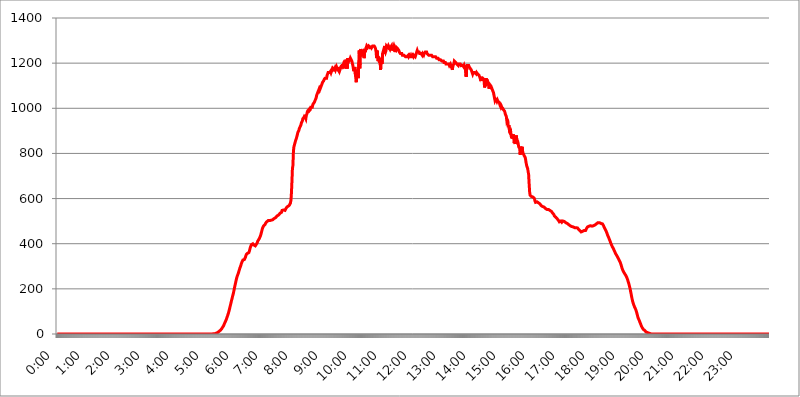
| Category | 2015.04.22. Intenzitás [W/m^2] |
|---|---|
| 0.0 | -0.256 |
| 0.0006944444444444445 | -0.256 |
| 0.001388888888888889 | -0.256 |
| 0.0020833333333333333 | -0.256 |
| 0.002777777777777778 | -0.256 |
| 0.003472222222222222 | -0.256 |
| 0.004166666666666667 | -0.256 |
| 0.004861111111111111 | -0.256 |
| 0.005555555555555556 | -0.256 |
| 0.0062499999999999995 | -0.256 |
| 0.006944444444444444 | -0.256 |
| 0.007638888888888889 | -0.256 |
| 0.008333333333333333 | -0.256 |
| 0.009027777777777779 | -0.256 |
| 0.009722222222222222 | -0.256 |
| 0.010416666666666666 | -0.256 |
| 0.011111111111111112 | -0.256 |
| 0.011805555555555555 | -0.256 |
| 0.012499999999999999 | -0.256 |
| 0.013194444444444444 | -0.256 |
| 0.013888888888888888 | -0.256 |
| 0.014583333333333332 | -0.256 |
| 0.015277777777777777 | -0.256 |
| 0.015972222222222224 | -0.256 |
| 0.016666666666666666 | -0.256 |
| 0.017361111111111112 | -0.256 |
| 0.018055555555555557 | -0.256 |
| 0.01875 | -0.256 |
| 0.019444444444444445 | -0.256 |
| 0.02013888888888889 | -0.256 |
| 0.020833333333333332 | -0.256 |
| 0.02152777777777778 | -0.256 |
| 0.022222222222222223 | -0.256 |
| 0.02291666666666667 | -0.256 |
| 0.02361111111111111 | -0.256 |
| 0.024305555555555556 | -0.256 |
| 0.024999999999999998 | -0.256 |
| 0.025694444444444447 | -0.256 |
| 0.02638888888888889 | -0.256 |
| 0.027083333333333334 | -0.256 |
| 0.027777777777777776 | -0.256 |
| 0.02847222222222222 | -0.256 |
| 0.029166666666666664 | -0.256 |
| 0.029861111111111113 | -0.256 |
| 0.030555555555555555 | -0.256 |
| 0.03125 | -0.256 |
| 0.03194444444444445 | -0.256 |
| 0.03263888888888889 | -0.256 |
| 0.03333333333333333 | -0.256 |
| 0.034027777777777775 | -0.256 |
| 0.034722222222222224 | -0.256 |
| 0.035416666666666666 | -0.256 |
| 0.036111111111111115 | -0.256 |
| 0.03680555555555556 | -0.256 |
| 0.0375 | -0.256 |
| 0.03819444444444444 | -0.256 |
| 0.03888888888888889 | -0.256 |
| 0.03958333333333333 | -0.256 |
| 0.04027777777777778 | -0.256 |
| 0.04097222222222222 | -0.256 |
| 0.041666666666666664 | -0.256 |
| 0.042361111111111106 | -0.256 |
| 0.04305555555555556 | -0.256 |
| 0.043750000000000004 | -0.256 |
| 0.044444444444444446 | -0.256 |
| 0.04513888888888889 | -0.256 |
| 0.04583333333333334 | -0.256 |
| 0.04652777777777778 | -0.256 |
| 0.04722222222222222 | -0.256 |
| 0.04791666666666666 | -0.256 |
| 0.04861111111111111 | -0.256 |
| 0.049305555555555554 | -0.256 |
| 0.049999999999999996 | -0.256 |
| 0.05069444444444445 | -0.256 |
| 0.051388888888888894 | -0.256 |
| 0.052083333333333336 | -0.256 |
| 0.05277777777777778 | -0.256 |
| 0.05347222222222222 | -0.256 |
| 0.05416666666666667 | -0.256 |
| 0.05486111111111111 | -0.256 |
| 0.05555555555555555 | -0.256 |
| 0.05625 | -0.256 |
| 0.05694444444444444 | -0.256 |
| 0.057638888888888885 | -0.256 |
| 0.05833333333333333 | -0.256 |
| 0.05902777777777778 | -0.256 |
| 0.059722222222222225 | -0.256 |
| 0.06041666666666667 | -0.256 |
| 0.061111111111111116 | -0.256 |
| 0.06180555555555556 | -0.256 |
| 0.0625 | -0.256 |
| 0.06319444444444444 | -0.256 |
| 0.06388888888888888 | -0.256 |
| 0.06458333333333334 | -0.256 |
| 0.06527777777777778 | -0.256 |
| 0.06597222222222222 | -0.256 |
| 0.06666666666666667 | -0.256 |
| 0.06736111111111111 | -0.256 |
| 0.06805555555555555 | -0.256 |
| 0.06874999999999999 | -0.256 |
| 0.06944444444444443 | -0.256 |
| 0.07013888888888889 | -0.256 |
| 0.07083333333333333 | -0.256 |
| 0.07152777777777779 | -0.256 |
| 0.07222222222222223 | -0.256 |
| 0.07291666666666667 | -0.256 |
| 0.07361111111111111 | -0.256 |
| 0.07430555555555556 | -0.256 |
| 0.075 | -0.256 |
| 0.07569444444444444 | -0.256 |
| 0.0763888888888889 | -0.256 |
| 0.07708333333333334 | -0.256 |
| 0.07777777777777778 | -0.256 |
| 0.07847222222222222 | -0.256 |
| 0.07916666666666666 | -0.256 |
| 0.0798611111111111 | -0.256 |
| 0.08055555555555556 | -0.256 |
| 0.08125 | -0.256 |
| 0.08194444444444444 | -0.256 |
| 0.08263888888888889 | -0.256 |
| 0.08333333333333333 | -0.256 |
| 0.08402777777777777 | -0.256 |
| 0.08472222222222221 | -0.256 |
| 0.08541666666666665 | -0.256 |
| 0.08611111111111112 | -0.256 |
| 0.08680555555555557 | -0.256 |
| 0.08750000000000001 | -0.256 |
| 0.08819444444444445 | -0.256 |
| 0.08888888888888889 | -0.256 |
| 0.08958333333333333 | -0.256 |
| 0.09027777777777778 | -0.256 |
| 0.09097222222222222 | -0.256 |
| 0.09166666666666667 | -0.256 |
| 0.09236111111111112 | -0.256 |
| 0.09305555555555556 | -0.256 |
| 0.09375 | -0.256 |
| 0.09444444444444444 | -0.256 |
| 0.09513888888888888 | -0.256 |
| 0.09583333333333333 | -0.256 |
| 0.09652777777777777 | -0.256 |
| 0.09722222222222222 | -0.256 |
| 0.09791666666666667 | -0.256 |
| 0.09861111111111111 | -0.256 |
| 0.09930555555555555 | -0.256 |
| 0.09999999999999999 | -0.256 |
| 0.10069444444444443 | -0.256 |
| 0.1013888888888889 | -0.256 |
| 0.10208333333333335 | -0.256 |
| 0.10277777777777779 | -0.256 |
| 0.10347222222222223 | -0.256 |
| 0.10416666666666667 | -0.256 |
| 0.10486111111111111 | -0.256 |
| 0.10555555555555556 | -0.256 |
| 0.10625 | -0.256 |
| 0.10694444444444444 | -0.256 |
| 0.1076388888888889 | -0.256 |
| 0.10833333333333334 | -0.256 |
| 0.10902777777777778 | -0.256 |
| 0.10972222222222222 | -0.256 |
| 0.1111111111111111 | -0.256 |
| 0.11180555555555556 | -0.256 |
| 0.11180555555555556 | -0.256 |
| 0.1125 | -0.256 |
| 0.11319444444444444 | -0.256 |
| 0.11388888888888889 | -0.256 |
| 0.11458333333333333 | -0.256 |
| 0.11527777777777777 | -0.256 |
| 0.11597222222222221 | -0.256 |
| 0.11666666666666665 | -0.256 |
| 0.1173611111111111 | -0.256 |
| 0.11805555555555557 | -0.256 |
| 0.11944444444444445 | -0.256 |
| 0.12013888888888889 | -0.256 |
| 0.12083333333333333 | -0.256 |
| 0.12152777777777778 | -0.256 |
| 0.12222222222222223 | -0.256 |
| 0.12291666666666667 | -0.256 |
| 0.12291666666666667 | -0.256 |
| 0.12361111111111112 | -0.256 |
| 0.12430555555555556 | -0.256 |
| 0.125 | -0.256 |
| 0.12569444444444444 | -0.256 |
| 0.12638888888888888 | -0.256 |
| 0.12708333333333333 | -0.256 |
| 0.16875 | -0.256 |
| 0.12847222222222224 | -0.256 |
| 0.12916666666666668 | -0.256 |
| 0.12986111111111112 | -0.256 |
| 0.13055555555555556 | -0.256 |
| 0.13125 | -0.256 |
| 0.13194444444444445 | -0.256 |
| 0.1326388888888889 | -0.256 |
| 0.13333333333333333 | -0.256 |
| 0.13402777777777777 | -0.256 |
| 0.13402777777777777 | -0.256 |
| 0.13472222222222222 | -0.256 |
| 0.13541666666666666 | -0.256 |
| 0.1361111111111111 | -0.256 |
| 0.13749999999999998 | -0.256 |
| 0.13819444444444443 | -0.256 |
| 0.1388888888888889 | -0.256 |
| 0.13958333333333334 | -0.256 |
| 0.14027777777777778 | -0.256 |
| 0.14097222222222222 | -0.256 |
| 0.14166666666666666 | -0.256 |
| 0.1423611111111111 | -0.256 |
| 0.14305555555555557 | -0.256 |
| 0.14375000000000002 | -0.256 |
| 0.14444444444444446 | -0.256 |
| 0.1451388888888889 | -0.256 |
| 0.1451388888888889 | -0.256 |
| 0.14652777777777778 | -0.256 |
| 0.14722222222222223 | -0.256 |
| 0.14791666666666667 | -0.256 |
| 0.1486111111111111 | -0.256 |
| 0.14930555555555555 | -0.256 |
| 0.15 | -0.256 |
| 0.15069444444444444 | -0.256 |
| 0.15138888888888888 | -0.256 |
| 0.15208333333333332 | -0.256 |
| 0.15277777777777776 | -0.256 |
| 0.15347222222222223 | -0.256 |
| 0.15416666666666667 | -0.256 |
| 0.15486111111111112 | -0.256 |
| 0.15555555555555556 | -0.256 |
| 0.15625 | -0.256 |
| 0.15694444444444444 | -0.256 |
| 0.15763888888888888 | -0.256 |
| 0.15833333333333333 | -0.256 |
| 0.15902777777777777 | -0.256 |
| 0.15972222222222224 | -0.256 |
| 0.16041666666666668 | -0.256 |
| 0.16111111111111112 | -0.256 |
| 0.16180555555555556 | -0.256 |
| 0.1625 | -0.256 |
| 0.16319444444444445 | -0.256 |
| 0.1638888888888889 | -0.256 |
| 0.16458333333333333 | -0.256 |
| 0.16527777777777777 | -0.256 |
| 0.16597222222222222 | -0.256 |
| 0.16666666666666666 | -0.256 |
| 0.1673611111111111 | -0.256 |
| 0.16805555555555554 | -0.256 |
| 0.16874999999999998 | -0.256 |
| 0.16944444444444443 | -0.256 |
| 0.17013888888888887 | -0.256 |
| 0.1708333333333333 | -0.256 |
| 0.17152777777777775 | -0.256 |
| 0.17222222222222225 | -0.256 |
| 0.1729166666666667 | -0.256 |
| 0.17361111111111113 | -0.256 |
| 0.17430555555555557 | -0.256 |
| 0.17500000000000002 | -0.256 |
| 0.17569444444444446 | -0.256 |
| 0.1763888888888889 | -0.256 |
| 0.17708333333333334 | -0.256 |
| 0.17777777777777778 | -0.256 |
| 0.17847222222222223 | -0.256 |
| 0.17916666666666667 | -0.256 |
| 0.1798611111111111 | -0.256 |
| 0.18055555555555555 | -0.256 |
| 0.18125 | -0.256 |
| 0.18194444444444444 | -0.256 |
| 0.1826388888888889 | -0.256 |
| 0.18333333333333335 | -0.256 |
| 0.1840277777777778 | -0.256 |
| 0.18472222222222223 | -0.256 |
| 0.18541666666666667 | -0.256 |
| 0.18611111111111112 | -0.256 |
| 0.18680555555555556 | -0.256 |
| 0.1875 | -0.256 |
| 0.18819444444444444 | -0.256 |
| 0.18888888888888888 | -0.256 |
| 0.18958333333333333 | -0.256 |
| 0.19027777777777777 | -0.256 |
| 0.1909722222222222 | -0.256 |
| 0.19166666666666665 | -0.256 |
| 0.19236111111111112 | -0.256 |
| 0.19305555555555554 | -0.256 |
| 0.19375 | -0.256 |
| 0.19444444444444445 | -0.256 |
| 0.1951388888888889 | -0.256 |
| 0.19583333333333333 | -0.256 |
| 0.19652777777777777 | -0.256 |
| 0.19722222222222222 | -0.256 |
| 0.19791666666666666 | -0.256 |
| 0.1986111111111111 | -0.256 |
| 0.19930555555555554 | -0.256 |
| 0.19999999999999998 | -0.256 |
| 0.20069444444444443 | -0.256 |
| 0.20138888888888887 | -0.256 |
| 0.2020833333333333 | -0.256 |
| 0.2027777777777778 | -0.256 |
| 0.2034722222222222 | -0.256 |
| 0.2041666666666667 | -0.256 |
| 0.20486111111111113 | -0.256 |
| 0.20555555555555557 | -0.256 |
| 0.20625000000000002 | -0.256 |
| 0.20694444444444446 | -0.256 |
| 0.2076388888888889 | -0.256 |
| 0.20833333333333334 | -0.256 |
| 0.20902777777777778 | -0.256 |
| 0.20972222222222223 | -0.256 |
| 0.21041666666666667 | -0.256 |
| 0.2111111111111111 | -0.256 |
| 0.21180555555555555 | -0.256 |
| 0.2125 | -0.256 |
| 0.21319444444444444 | -0.256 |
| 0.2138888888888889 | -0.256 |
| 0.21458333333333335 | -0.256 |
| 0.2152777777777778 | -0.256 |
| 0.21597222222222223 | -0.256 |
| 0.21666666666666667 | -0.256 |
| 0.21736111111111112 | 1.09 |
| 0.21805555555555556 | 1.09 |
| 0.21875 | 1.09 |
| 0.21944444444444444 | 1.09 |
| 0.22013888888888888 | 1.09 |
| 0.22083333333333333 | 1.09 |
| 0.22152777777777777 | 2.439 |
| 0.2222222222222222 | 2.439 |
| 0.22291666666666665 | 3.791 |
| 0.2236111111111111 | 3.791 |
| 0.22430555555555556 | 5.146 |
| 0.225 | 6.503 |
| 0.22569444444444445 | 9.225 |
| 0.2263888888888889 | 10.589 |
| 0.22708333333333333 | 11.956 |
| 0.22777777777777777 | 13.325 |
| 0.22847222222222222 | 14.696 |
| 0.22916666666666666 | 17.444 |
| 0.2298611111111111 | 20.201 |
| 0.23055555555555554 | 22.965 |
| 0.23124999999999998 | 27.124 |
| 0.23194444444444443 | 29.905 |
| 0.23263888888888887 | 34.086 |
| 0.2333333333333333 | 36.881 |
| 0.2340277777777778 | 42.483 |
| 0.2347222222222222 | 46.695 |
| 0.2354166666666667 | 52.322 |
| 0.23611111111111113 | 56.548 |
| 0.23680555555555557 | 62.189 |
| 0.23750000000000002 | 67.835 |
| 0.23819444444444446 | 74.892 |
| 0.2388888888888889 | 80.536 |
| 0.23958333333333334 | 87.583 |
| 0.24027777777777778 | 94.617 |
| 0.24097222222222223 | 103.035 |
| 0.24166666666666667 | 111.42 |
| 0.2423611111111111 | 121.152 |
| 0.24305555555555555 | 129.444 |
| 0.24375 | 139.051 |
| 0.24444444444444446 | 148.579 |
| 0.24513888888888888 | 156.678 |
| 0.24583333333333335 | 166.044 |
| 0.2465277777777778 | 173.996 |
| 0.24722222222222223 | 183.184 |
| 0.24791666666666667 | 193.561 |
| 0.24861111111111112 | 205.079 |
| 0.24930555555555556 | 215.177 |
| 0.25 | 225.146 |
| 0.25069444444444444 | 234.99 |
| 0.2513888888888889 | 244.717 |
| 0.2520833333333333 | 253.137 |
| 0.25277777777777777 | 259.104 |
| 0.2534722222222222 | 265.034 |
| 0.25416666666666665 | 270.931 |
| 0.2548611111111111 | 279.136 |
| 0.2555555555555556 | 286.13 |
| 0.25625000000000003 | 293.096 |
| 0.2569444444444445 | 298.885 |
| 0.2576388888888889 | 305.819 |
| 0.25833333333333336 | 312.749 |
| 0.2590277777777778 | 318.527 |
| 0.25972222222222224 | 321.998 |
| 0.2604166666666667 | 327.793 |
| 0.2611111111111111 | 331.279 |
| 0.26180555555555557 | 326.633 |
| 0.2625 | 330.117 |
| 0.26319444444444445 | 332.443 |
| 0.2638888888888889 | 339.449 |
| 0.26458333333333334 | 347.682 |
| 0.2652777777777778 | 352.423 |
| 0.2659722222222222 | 354.805 |
| 0.26666666666666666 | 357.196 |
| 0.2673611111111111 | 357.196 |
| 0.26805555555555555 | 357.196 |
| 0.26875 | 360.798 |
| 0.26944444444444443 | 366.851 |
| 0.2701388888888889 | 375.442 |
| 0.2708333333333333 | 384.191 |
| 0.27152777777777776 | 389.27 |
| 0.2722222222222222 | 395.711 |
| 0.27291666666666664 | 397.012 |
| 0.2736111111111111 | 399.628 |
| 0.2743055555555555 | 399.628 |
| 0.27499999999999997 | 398.318 |
| 0.27569444444444446 | 394.415 |
| 0.27638888888888885 | 391.834 |
| 0.27708333333333335 | 390.55 |
| 0.2777777777777778 | 390.55 |
| 0.27847222222222223 | 391.834 |
| 0.2791666666666667 | 397.012 |
| 0.2798611111111111 | 398.318 |
| 0.28055555555555556 | 404.916 |
| 0.28125 | 411.638 |
| 0.28194444444444444 | 412.998 |
| 0.2826388888888889 | 415.735 |
| 0.2833333333333333 | 422.678 |
| 0.28402777777777777 | 425.497 |
| 0.2847222222222222 | 432.656 |
| 0.28541666666666665 | 438.503 |
| 0.28611111111111115 | 447.487 |
| 0.28680555555555554 | 455.184 |
| 0.28750000000000003 | 464.688 |
| 0.2881944444444445 | 471.198 |
| 0.2888888888888889 | 474.507 |
| 0.28958333333333336 | 479.541 |
| 0.2902777777777778 | 482.945 |
| 0.29097222222222224 | 477.854 |
| 0.2916666666666667 | 486.389 |
| 0.2923611111111111 | 491.63 |
| 0.29305555555555557 | 491.63 |
| 0.29375 | 496.965 |
| 0.29444444444444445 | 496.965 |
| 0.2951388888888889 | 495.176 |
| 0.29583333333333334 | 502.396 |
| 0.2965277777777778 | 504.229 |
| 0.2972222222222222 | 500.575 |
| 0.29791666666666666 | 502.396 |
| 0.2986111111111111 | 498.764 |
| 0.29930555555555555 | 502.396 |
| 0.3 | 504.229 |
| 0.30069444444444443 | 504.229 |
| 0.3013888888888889 | 507.927 |
| 0.3020833333333333 | 506.072 |
| 0.30277777777777776 | 509.793 |
| 0.3034722222222222 | 509.793 |
| 0.30416666666666664 | 511.671 |
| 0.3048611111111111 | 513.561 |
| 0.3055555555555555 | 515.462 |
| 0.30624999999999997 | 515.462 |
| 0.3069444444444444 | 519.3 |
| 0.3076388888888889 | 519.3 |
| 0.30833333333333335 | 523.186 |
| 0.3090277777777778 | 525.148 |
| 0.30972222222222223 | 523.186 |
| 0.3104166666666667 | 527.122 |
| 0.3111111111111111 | 529.108 |
| 0.31180555555555556 | 531.108 |
| 0.3125 | 535.145 |
| 0.31319444444444444 | 533.12 |
| 0.3138888888888889 | 539.234 |
| 0.3145833333333333 | 539.234 |
| 0.31527777777777777 | 547.572 |
| 0.3159722222222222 | 547.572 |
| 0.31666666666666665 | 547.572 |
| 0.31736111111111115 | 549.691 |
| 0.31805555555555554 | 547.572 |
| 0.31875000000000003 | 551.823 |
| 0.3194444444444445 | 547.572 |
| 0.3201388888888889 | 549.691 |
| 0.32083333333333336 | 556.131 |
| 0.3215277777777778 | 558.305 |
| 0.32222222222222224 | 562.699 |
| 0.3229166666666667 | 564.917 |
| 0.3236111111111111 | 564.917 |
| 0.32430555555555557 | 567.15 |
| 0.325 | 569.398 |
| 0.32569444444444445 | 571.661 |
| 0.3263888888888889 | 576.233 |
| 0.32708333333333334 | 580.866 |
| 0.3277777777777778 | 592.725 |
| 0.3284722222222222 | 625.508 |
| 0.32916666666666666 | 676.003 |
| 0.3298611111111111 | 733.184 |
| 0.33055555555555555 | 746.886 |
| 0.33125 | 809.522 |
| 0.33194444444444443 | 829.377 |
| 0.3326388888888889 | 837.51 |
| 0.3333333333333333 | 841.619 |
| 0.3340277777777778 | 854.113 |
| 0.3347222222222222 | 858.335 |
| 0.3354166666666667 | 866.865 |
| 0.3361111111111111 | 875.511 |
| 0.3368055555555556 | 884.274 |
| 0.33749999999999997 | 893.157 |
| 0.33819444444444446 | 893.157 |
| 0.33888888888888885 | 902.16 |
| 0.33958333333333335 | 911.285 |
| 0.34027777777777773 | 915.893 |
| 0.34097222222222223 | 920.533 |
| 0.3416666666666666 | 925.203 |
| 0.3423611111111111 | 934.639 |
| 0.3430555555555555 | 939.404 |
| 0.34375 | 944.201 |
| 0.3444444444444445 | 953.892 |
| 0.3451388888888889 | 953.892 |
| 0.3458333333333334 | 958.785 |
| 0.34652777777777777 | 963.712 |
| 0.34722222222222227 | 963.712 |
| 0.34791666666666665 | 958.785 |
| 0.34861111111111115 | 953.892 |
| 0.34930555555555554 | 968.671 |
| 0.35000000000000003 | 973.663 |
| 0.3506944444444444 | 983.747 |
| 0.3513888888888889 | 988.839 |
| 0.3520833333333333 | 988.839 |
| 0.3527777777777778 | 993.965 |
| 0.3534722222222222 | 988.839 |
| 0.3541666666666667 | 988.839 |
| 0.3548611111111111 | 993.965 |
| 0.35555555555555557 | 1004.318 |
| 0.35625 | 1004.318 |
| 0.35694444444444445 | 1004.318 |
| 0.3576388888888889 | 1004.318 |
| 0.35833333333333334 | 1014.809 |
| 0.3590277777777778 | 1020.106 |
| 0.3597222222222222 | 1020.106 |
| 0.36041666666666666 | 1025.437 |
| 0.3611111111111111 | 1025.437 |
| 0.36180555555555555 | 1036.206 |
| 0.3625 | 1041.644 |
| 0.36319444444444443 | 1047.117 |
| 0.3638888888888889 | 1058.17 |
| 0.3645833333333333 | 1063.751 |
| 0.3652777777777778 | 1069.368 |
| 0.3659722222222222 | 1075.021 |
| 0.3666666666666667 | 1080.711 |
| 0.3673611111111111 | 1086.439 |
| 0.3680555555555556 | 1080.711 |
| 0.36874999999999997 | 1086.439 |
| 0.36944444444444446 | 1086.439 |
| 0.37013888888888885 | 1098.004 |
| 0.37083333333333335 | 1103.843 |
| 0.37152777777777773 | 1109.72 |
| 0.37222222222222223 | 1115.634 |
| 0.3729166666666666 | 1115.634 |
| 0.3736111111111111 | 1121.587 |
| 0.3743055555555555 | 1127.578 |
| 0.375 | 1127.578 |
| 0.3756944444444445 | 1133.607 |
| 0.3763888888888889 | 1133.607 |
| 0.3770833333333334 | 1133.607 |
| 0.37777777777777777 | 1133.607 |
| 0.37847222222222227 | 1145.782 |
| 0.37916666666666665 | 1151.928 |
| 0.37986111111111115 | 1158.113 |
| 0.38055555555555554 | 1158.113 |
| 0.38125000000000003 | 1158.113 |
| 0.3819444444444444 | 1158.113 |
| 0.3826388888888889 | 1158.113 |
| 0.3833333333333333 | 1164.337 |
| 0.3840277777777778 | 1158.113 |
| 0.3847222222222222 | 1158.113 |
| 0.3854166666666667 | 1170.601 |
| 0.3861111111111111 | 1164.337 |
| 0.38680555555555557 | 1176.905 |
| 0.3875 | 1176.905 |
| 0.38819444444444445 | 1176.905 |
| 0.3888888888888889 | 1170.601 |
| 0.38958333333333334 | 1176.905 |
| 0.3902777777777778 | 1170.601 |
| 0.3909722222222222 | 1176.905 |
| 0.39166666666666666 | 1183.249 |
| 0.3923611111111111 | 1176.905 |
| 0.39305555555555555 | 1176.905 |
| 0.39375 | 1170.601 |
| 0.39444444444444443 | 1183.249 |
| 0.3951388888888889 | 1170.601 |
| 0.3958333333333333 | 1164.337 |
| 0.3965277777777778 | 1170.601 |
| 0.3972222222222222 | 1176.905 |
| 0.3979166666666667 | 1183.249 |
| 0.3986111111111111 | 1189.633 |
| 0.3993055555555556 | 1176.905 |
| 0.39999999999999997 | 1196.058 |
| 0.40069444444444446 | 1189.633 |
| 0.40138888888888885 | 1196.058 |
| 0.40208333333333335 | 1189.633 |
| 0.40277777777777773 | 1176.905 |
| 0.40347222222222223 | 1196.058 |
| 0.4041666666666666 | 1202.523 |
| 0.4048611111111111 | 1215.576 |
| 0.4055555555555555 | 1176.905 |
| 0.40625 | 1196.058 |
| 0.4069444444444445 | 1176.905 |
| 0.4076388888888889 | 1222.164 |
| 0.4083333333333334 | 1215.576 |
| 0.40902777777777777 | 1209.029 |
| 0.40972222222222227 | 1209.029 |
| 0.41041666666666665 | 1215.576 |
| 0.41111111111111115 | 1222.164 |
| 0.41180555555555554 | 1222.164 |
| 0.41250000000000003 | 1222.164 |
| 0.4131944444444444 | 1209.029 |
| 0.4138888888888889 | 1209.029 |
| 0.4145833333333333 | 1189.633 |
| 0.4152777777777778 | 1176.905 |
| 0.4159722222222222 | 1164.337 |
| 0.4166666666666667 | 1164.337 |
| 0.4173611111111111 | 1183.249 |
| 0.41805555555555557 | 1151.928 |
| 0.41875 | 1151.928 |
| 0.41944444444444445 | 1115.634 |
| 0.4201388888888889 | 1170.601 |
| 0.42083333333333334 | 1151.928 |
| 0.4215277777777778 | 1158.113 |
| 0.4222222222222222 | 1133.607 |
| 0.42291666666666666 | 1202.523 |
| 0.4236111111111111 | 1255.731 |
| 0.42430555555555555 | 1176.905 |
| 0.425 | 1248.934 |
| 0.42569444444444443 | 1262.571 |
| 0.4263888888888889 | 1262.571 |
| 0.4270833333333333 | 1242.179 |
| 0.4277777777777778 | 1242.179 |
| 0.4284722222222222 | 1248.934 |
| 0.4291666666666667 | 1235.465 |
| 0.4298611111111111 | 1235.465 |
| 0.4305555555555556 | 1222.164 |
| 0.43124999999999997 | 1262.571 |
| 0.43194444444444446 | 1248.934 |
| 0.43263888888888885 | 1248.934 |
| 0.43333333333333335 | 1269.454 |
| 0.43402777777777773 | 1276.38 |
| 0.43472222222222223 | 1276.38 |
| 0.4354166666666666 | 1269.454 |
| 0.4361111111111111 | 1269.454 |
| 0.4368055555555555 | 1276.38 |
| 0.4375 | 1276.38 |
| 0.4381944444444445 | 1276.38 |
| 0.4388888888888889 | 1269.454 |
| 0.4395833333333334 | 1262.571 |
| 0.44027777777777777 | 1276.38 |
| 0.44097222222222227 | 1269.454 |
| 0.44166666666666665 | 1269.454 |
| 0.44236111111111115 | 1276.38 |
| 0.44305555555555554 | 1276.38 |
| 0.44375000000000003 | 1276.38 |
| 0.4444444444444444 | 1276.38 |
| 0.4451388888888889 | 1276.38 |
| 0.4458333333333333 | 1269.454 |
| 0.4465277777777778 | 1262.571 |
| 0.4472222222222222 | 1248.934 |
| 0.4479166666666667 | 1222.164 |
| 0.4486111111111111 | 1255.731 |
| 0.44930555555555557 | 1235.465 |
| 0.45 | 1209.029 |
| 0.45069444444444445 | 1228.794 |
| 0.4513888888888889 | 1209.029 |
| 0.45208333333333334 | 1202.523 |
| 0.4527777777777778 | 1222.164 |
| 0.4534722222222222 | 1170.601 |
| 0.45416666666666666 | 1209.029 |
| 0.4548611111111111 | 1209.029 |
| 0.45555555555555555 | 1196.058 |
| 0.45625 | 1242.179 |
| 0.45694444444444443 | 1248.934 |
| 0.4576388888888889 | 1242.179 |
| 0.4583333333333333 | 1255.731 |
| 0.4590277777777778 | 1276.38 |
| 0.4597222222222222 | 1255.731 |
| 0.4604166666666667 | 1248.934 |
| 0.4611111111111111 | 1255.731 |
| 0.4618055555555556 | 1276.38 |
| 0.46249999999999997 | 1276.38 |
| 0.46319444444444446 | 1276.38 |
| 0.46388888888888885 | 1269.454 |
| 0.46458333333333335 | 1276.38 |
| 0.46527777777777773 | 1276.38 |
| 0.46597222222222223 | 1276.38 |
| 0.4666666666666666 | 1262.571 |
| 0.4673611111111111 | 1269.454 |
| 0.4680555555555555 | 1269.454 |
| 0.46875 | 1276.38 |
| 0.4694444444444445 | 1255.731 |
| 0.4701388888888889 | 1262.571 |
| 0.4708333333333334 | 1276.38 |
| 0.47152777777777777 | 1269.454 |
| 0.47222222222222227 | 1276.38 |
| 0.47291666666666665 | 1276.38 |
| 0.47361111111111115 | 1262.571 |
| 0.47430555555555554 | 1248.934 |
| 0.47500000000000003 | 1255.731 |
| 0.4756944444444444 | 1269.454 |
| 0.4763888888888889 | 1269.454 |
| 0.4770833333333333 | 1269.454 |
| 0.4777777777777778 | 1262.571 |
| 0.4784722222222222 | 1262.571 |
| 0.4791666666666667 | 1255.731 |
| 0.4798611111111111 | 1248.934 |
| 0.48055555555555557 | 1248.934 |
| 0.48125 | 1242.179 |
| 0.48194444444444445 | 1242.179 |
| 0.4826388888888889 | 1242.179 |
| 0.48333333333333334 | 1242.179 |
| 0.4840277777777778 | 1235.465 |
| 0.4847222222222222 | 1235.465 |
| 0.48541666666666666 | 1235.465 |
| 0.4861111111111111 | 1235.465 |
| 0.48680555555555555 | 1235.465 |
| 0.4875 | 1235.465 |
| 0.48819444444444443 | 1228.794 |
| 0.4888888888888889 | 1228.794 |
| 0.4895833333333333 | 1228.794 |
| 0.4902777777777778 | 1228.794 |
| 0.4909722222222222 | 1228.794 |
| 0.4916666666666667 | 1228.794 |
| 0.4923611111111111 | 1235.465 |
| 0.4930555555555556 | 1228.794 |
| 0.49374999999999997 | 1228.794 |
| 0.49444444444444446 | 1235.465 |
| 0.49513888888888885 | 1228.794 |
| 0.49583333333333335 | 1228.794 |
| 0.49652777777777773 | 1228.794 |
| 0.49722222222222223 | 1228.794 |
| 0.4979166666666666 | 1235.465 |
| 0.4986111111111111 | 1235.465 |
| 0.4993055555555555 | 1228.794 |
| 0.5 | 1235.465 |
| 0.5006944444444444 | 1235.465 |
| 0.5013888888888889 | 1235.465 |
| 0.5020833333333333 | 1228.794 |
| 0.5027777777777778 | 1235.465 |
| 0.5034722222222222 | 1242.179 |
| 0.5041666666666667 | 1248.934 |
| 0.5048611111111111 | 1255.731 |
| 0.5055555555555555 | 1248.934 |
| 0.50625 | 1248.934 |
| 0.5069444444444444 | 1248.934 |
| 0.5076388888888889 | 1248.934 |
| 0.5083333333333333 | 1242.179 |
| 0.5090277777777777 | 1242.179 |
| 0.5097222222222222 | 1242.179 |
| 0.5104166666666666 | 1242.179 |
| 0.5111111111111112 | 1242.179 |
| 0.5118055555555555 | 1235.465 |
| 0.5125000000000001 | 1242.179 |
| 0.5131944444444444 | 1242.179 |
| 0.513888888888889 | 1235.465 |
| 0.5145833333333333 | 1242.179 |
| 0.5152777777777778 | 1242.179 |
| 0.5159722222222222 | 1248.934 |
| 0.5166666666666667 | 1248.934 |
| 0.517361111111111 | 1248.934 |
| 0.5180555555555556 | 1248.934 |
| 0.5187499999999999 | 1242.179 |
| 0.5194444444444445 | 1242.179 |
| 0.5201388888888888 | 1242.179 |
| 0.5208333333333334 | 1235.465 |
| 0.5215277777777778 | 1235.465 |
| 0.5222222222222223 | 1235.465 |
| 0.5229166666666667 | 1235.465 |
| 0.5236111111111111 | 1235.465 |
| 0.5243055555555556 | 1235.465 |
| 0.525 | 1235.465 |
| 0.5256944444444445 | 1235.465 |
| 0.5263888888888889 | 1228.794 |
| 0.5270833333333333 | 1228.794 |
| 0.5277777777777778 | 1228.794 |
| 0.5284722222222222 | 1228.794 |
| 0.5291666666666667 | 1228.794 |
| 0.5298611111111111 | 1228.794 |
| 0.5305555555555556 | 1228.794 |
| 0.53125 | 1228.794 |
| 0.5319444444444444 | 1222.164 |
| 0.5326388888888889 | 1222.164 |
| 0.5333333333333333 | 1222.164 |
| 0.5340277777777778 | 1222.164 |
| 0.5347222222222222 | 1222.164 |
| 0.5354166666666667 | 1215.576 |
| 0.5361111111111111 | 1215.576 |
| 0.5368055555555555 | 1215.576 |
| 0.5375 | 1215.576 |
| 0.5381944444444444 | 1215.576 |
| 0.5388888888888889 | 1215.576 |
| 0.5395833333333333 | 1209.029 |
| 0.5402777777777777 | 1209.029 |
| 0.5409722222222222 | 1209.029 |
| 0.5416666666666666 | 1209.029 |
| 0.5423611111111112 | 1202.523 |
| 0.5430555555555555 | 1202.523 |
| 0.5437500000000001 | 1202.523 |
| 0.5444444444444444 | 1202.523 |
| 0.545138888888889 | 1196.058 |
| 0.5458333333333333 | 1196.058 |
| 0.5465277777777778 | 1196.058 |
| 0.5472222222222222 | 1196.058 |
| 0.5479166666666667 | 1196.058 |
| 0.548611111111111 | 1196.058 |
| 0.5493055555555556 | 1196.058 |
| 0.5499999999999999 | 1189.633 |
| 0.5506944444444445 | 1189.633 |
| 0.5513888888888888 | 1196.058 |
| 0.5520833333333334 | 1189.633 |
| 0.5527777777777778 | 1183.249 |
| 0.5534722222222223 | 1183.249 |
| 0.5541666666666667 | 1170.601 |
| 0.5548611111111111 | 1189.633 |
| 0.5555555555555556 | 1189.633 |
| 0.55625 | 1196.058 |
| 0.5569444444444445 | 1209.029 |
| 0.5576388888888889 | 1209.029 |
| 0.5583333333333333 | 1209.029 |
| 0.5590277777777778 | 1202.523 |
| 0.5597222222222222 | 1202.523 |
| 0.5604166666666667 | 1196.058 |
| 0.5611111111111111 | 1196.058 |
| 0.5618055555555556 | 1196.058 |
| 0.5625 | 1189.633 |
| 0.5631944444444444 | 1196.058 |
| 0.5638888888888889 | 1196.058 |
| 0.5645833333333333 | 1196.058 |
| 0.5652777777777778 | 1196.058 |
| 0.5659722222222222 | 1196.058 |
| 0.5666666666666667 | 1189.633 |
| 0.5673611111111111 | 1183.249 |
| 0.5680555555555555 | 1196.058 |
| 0.56875 | 1189.633 |
| 0.5694444444444444 | 1189.633 |
| 0.5701388888888889 | 1183.249 |
| 0.5708333333333333 | 1189.633 |
| 0.5715277777777777 | 1183.249 |
| 0.5722222222222222 | 1189.633 |
| 0.5729166666666666 | 1189.633 |
| 0.5736111111111112 | 1139.675 |
| 0.5743055555555555 | 1176.905 |
| 0.5750000000000001 | 1189.633 |
| 0.5756944444444444 | 1189.633 |
| 0.576388888888889 | 1189.633 |
| 0.5770833333333333 | 1189.633 |
| 0.5777777777777778 | 1183.249 |
| 0.5784722222222222 | 1183.249 |
| 0.5791666666666667 | 1176.905 |
| 0.579861111111111 | 1176.905 |
| 0.5805555555555556 | 1170.601 |
| 0.5812499999999999 | 1164.337 |
| 0.5819444444444445 | 1158.113 |
| 0.5826388888888888 | 1151.928 |
| 0.5833333333333334 | 1158.113 |
| 0.5840277777777778 | 1158.113 |
| 0.5847222222222223 | 1158.113 |
| 0.5854166666666667 | 1158.113 |
| 0.5861111111111111 | 1158.113 |
| 0.5868055555555556 | 1158.113 |
| 0.5875 | 1151.928 |
| 0.5881944444444445 | 1158.113 |
| 0.5888888888888889 | 1158.113 |
| 0.5895833333333333 | 1151.928 |
| 0.5902777777777778 | 1151.928 |
| 0.5909722222222222 | 1151.928 |
| 0.5916666666666667 | 1145.782 |
| 0.5923611111111111 | 1139.675 |
| 0.5930555555555556 | 1133.607 |
| 0.59375 | 1139.675 |
| 0.5944444444444444 | 1121.587 |
| 0.5951388888888889 | 1127.578 |
| 0.5958333333333333 | 1127.578 |
| 0.5965277777777778 | 1133.607 |
| 0.5972222222222222 | 1133.607 |
| 0.5979166666666667 | 1133.607 |
| 0.5986111111111111 | 1127.578 |
| 0.5993055555555555 | 1092.203 |
| 0.6 | 1103.843 |
| 0.6006944444444444 | 1098.004 |
| 0.6013888888888889 | 1133.607 |
| 0.6020833333333333 | 1115.634 |
| 0.6027777777777777 | 1127.578 |
| 0.6034722222222222 | 1115.634 |
| 0.6041666666666666 | 1109.72 |
| 0.6048611111111112 | 1103.843 |
| 0.6055555555555555 | 1086.439 |
| 0.6062500000000001 | 1092.203 |
| 0.6069444444444444 | 1103.843 |
| 0.607638888888889 | 1103.843 |
| 0.6083333333333333 | 1098.004 |
| 0.6090277777777778 | 1092.203 |
| 0.6097222222222222 | 1086.439 |
| 0.6104166666666667 | 1086.439 |
| 0.611111111111111 | 1075.021 |
| 0.6118055555555556 | 1069.368 |
| 0.6124999999999999 | 1058.17 |
| 0.6131944444444445 | 1058.17 |
| 0.6138888888888888 | 1036.206 |
| 0.6145833333333334 | 1041.644 |
| 0.6152777777777778 | 1041.644 |
| 0.6159722222222223 | 1036.206 |
| 0.6166666666666667 | 1030.804 |
| 0.6173611111111111 | 1036.206 |
| 0.6180555555555556 | 1030.804 |
| 0.61875 | 1030.804 |
| 0.6194444444444445 | 1030.804 |
| 0.6201388888888889 | 1025.437 |
| 0.6208333333333333 | 1014.809 |
| 0.6215277777777778 | 1014.809 |
| 0.6222222222222222 | 1004.318 |
| 0.6229166666666667 | 1009.546 |
| 0.6236111111111111 | 1004.318 |
| 0.6243055555555556 | 1004.318 |
| 0.625 | 999.125 |
| 0.6256944444444444 | 993.965 |
| 0.6263888888888889 | 993.965 |
| 0.6270833333333333 | 988.839 |
| 0.6277777777777778 | 983.747 |
| 0.6284722222222222 | 973.663 |
| 0.6291666666666667 | 973.663 |
| 0.6298611111111111 | 963.712 |
| 0.6305555555555555 | 944.201 |
| 0.63125 | 949.03 |
| 0.6319444444444444 | 944.201 |
| 0.6326388888888889 | 915.893 |
| 0.6333333333333333 | 925.203 |
| 0.6340277777777777 | 925.203 |
| 0.6347222222222222 | 893.157 |
| 0.6354166666666666 | 888.701 |
| 0.6361111111111112 | 893.157 |
| 0.6368055555555555 | 875.511 |
| 0.6375000000000001 | 866.865 |
| 0.6381944444444444 | 875.511 |
| 0.638888888888889 | 866.865 |
| 0.6395833333333333 | 884.274 |
| 0.6402777777777778 | 866.865 |
| 0.6409722222222222 | 845.755 |
| 0.6416666666666667 | 862.585 |
| 0.642361111111111 | 841.619 |
| 0.6430555555555556 | 858.335 |
| 0.6437499999999999 | 879.878 |
| 0.6444444444444445 | 862.585 |
| 0.6451388888888888 | 858.335 |
| 0.6458333333333334 | 854.113 |
| 0.6465277777777778 | 849.92 |
| 0.6472222222222223 | 829.377 |
| 0.6479166666666667 | 829.377 |
| 0.6486111111111111 | 821.353 |
| 0.6493055555555556 | 794.119 |
| 0.65 | 829.377 |
| 0.6506944444444445 | 813.439 |
| 0.6513888888888889 | 817.382 |
| 0.6520833333333333 | 829.377 |
| 0.6527777777777778 | 805.632 |
| 0.6534722222222222 | 805.632 |
| 0.6541666666666667 | 805.632 |
| 0.6548611111111111 | 790.334 |
| 0.6555555555555556 | 794.119 |
| 0.65625 | 782.842 |
| 0.6569444444444444 | 771.794 |
| 0.6576388888888889 | 757.414 |
| 0.6583333333333333 | 746.886 |
| 0.6590277777777778 | 746.886 |
| 0.6597222222222222 | 733.184 |
| 0.6604166666666667 | 729.817 |
| 0.6611111111111111 | 706.89 |
| 0.6618055555555555 | 667.146 |
| 0.6625 | 630.814 |
| 0.6631944444444444 | 615.11 |
| 0.6638888888888889 | 612.554 |
| 0.6645833333333333 | 610.016 |
| 0.6652777777777777 | 610.016 |
| 0.6659722222222222 | 610.016 |
| 0.6666666666666666 | 607.495 |
| 0.6673611111111111 | 604.992 |
| 0.6680555555555556 | 604.992 |
| 0.6687500000000001 | 602.505 |
| 0.6694444444444444 | 597.582 |
| 0.6701388888888888 | 587.934 |
| 0.6708333333333334 | 583.206 |
| 0.6715277777777778 | 585.562 |
| 0.6722222222222222 | 585.562 |
| 0.6729166666666666 | 585.562 |
| 0.6736111111111112 | 585.562 |
| 0.6743055555555556 | 583.206 |
| 0.6749999999999999 | 580.866 |
| 0.6756944444444444 | 580.866 |
| 0.6763888888888889 | 580.866 |
| 0.6770833333333334 | 576.233 |
| 0.6777777777777777 | 573.939 |
| 0.6784722222222223 | 569.398 |
| 0.6791666666666667 | 571.661 |
| 0.6798611111111111 | 567.15 |
| 0.6805555555555555 | 564.917 |
| 0.68125 | 564.917 |
| 0.6819444444444445 | 562.699 |
| 0.6826388888888889 | 562.699 |
| 0.6833333333333332 | 560.495 |
| 0.6840277777777778 | 558.305 |
| 0.6847222222222222 | 556.131 |
| 0.6854166666666667 | 551.823 |
| 0.686111111111111 | 551.823 |
| 0.6868055555555556 | 551.823 |
| 0.6875 | 551.823 |
| 0.6881944444444444 | 551.823 |
| 0.688888888888889 | 551.823 |
| 0.6895833333333333 | 551.823 |
| 0.6902777777777778 | 549.691 |
| 0.6909722222222222 | 547.572 |
| 0.6916666666666668 | 545.467 |
| 0.6923611111111111 | 543.376 |
| 0.6930555555555555 | 543.376 |
| 0.69375 | 541.298 |
| 0.6944444444444445 | 537.182 |
| 0.6951388888888889 | 535.145 |
| 0.6958333333333333 | 533.12 |
| 0.6965277777777777 | 529.108 |
| 0.6972222222222223 | 523.186 |
| 0.6979166666666666 | 521.237 |
| 0.6986111111111111 | 519.3 |
| 0.6993055555555556 | 517.375 |
| 0.7000000000000001 | 517.375 |
| 0.7006944444444444 | 513.561 |
| 0.7013888888888888 | 509.793 |
| 0.7020833333333334 | 507.927 |
| 0.7027777777777778 | 504.229 |
| 0.7034722222222222 | 500.575 |
| 0.7041666666666666 | 496.965 |
| 0.7048611111111112 | 496.965 |
| 0.7055555555555556 | 498.764 |
| 0.7062499999999999 | 500.575 |
| 0.7069444444444444 | 496.965 |
| 0.7076388888888889 | 495.176 |
| 0.7083333333333334 | 496.965 |
| 0.7090277777777777 | 500.575 |
| 0.7097222222222223 | 500.575 |
| 0.7104166666666667 | 498.764 |
| 0.7111111111111111 | 498.764 |
| 0.7118055555555555 | 496.965 |
| 0.7125 | 496.965 |
| 0.7131944444444445 | 493.398 |
| 0.7138888888888889 | 489.873 |
| 0.7145833333333332 | 489.873 |
| 0.7152777777777778 | 489.873 |
| 0.7159722222222222 | 489.873 |
| 0.7166666666666667 | 486.389 |
| 0.717361111111111 | 484.662 |
| 0.7180555555555556 | 482.945 |
| 0.71875 | 481.238 |
| 0.7194444444444444 | 479.541 |
| 0.720138888888889 | 479.541 |
| 0.7208333333333333 | 477.854 |
| 0.7215277777777778 | 476.176 |
| 0.7222222222222222 | 476.176 |
| 0.7229166666666668 | 476.176 |
| 0.7236111111111111 | 474.507 |
| 0.7243055555555555 | 472.848 |
| 0.725 | 472.848 |
| 0.7256944444444445 | 471.198 |
| 0.7263888888888889 | 472.848 |
| 0.7270833333333333 | 472.848 |
| 0.7277777777777777 | 471.198 |
| 0.7284722222222223 | 472.848 |
| 0.7291666666666666 | 471.198 |
| 0.7298611111111111 | 469.557 |
| 0.7305555555555556 | 466.302 |
| 0.7312500000000001 | 463.083 |
| 0.7319444444444444 | 461.486 |
| 0.7326388888888888 | 459.898 |
| 0.7333333333333334 | 456.747 |
| 0.7340277777777778 | 455.184 |
| 0.7347222222222222 | 452.082 |
| 0.7354166666666666 | 452.082 |
| 0.7361111111111112 | 452.082 |
| 0.7368055555555556 | 455.184 |
| 0.7374999999999999 | 455.184 |
| 0.7381944444444444 | 458.318 |
| 0.7388888888888889 | 458.318 |
| 0.7395833333333334 | 458.318 |
| 0.7402777777777777 | 458.318 |
| 0.7409722222222223 | 458.318 |
| 0.7416666666666667 | 463.083 |
| 0.7423611111111111 | 467.925 |
| 0.7430555555555555 | 471.198 |
| 0.74375 | 474.507 |
| 0.7444444444444445 | 476.176 |
| 0.7451388888888889 | 477.854 |
| 0.7458333333333332 | 477.854 |
| 0.7465277777777778 | 477.854 |
| 0.7472222222222222 | 477.854 |
| 0.7479166666666667 | 479.541 |
| 0.748611111111111 | 476.176 |
| 0.7493055555555556 | 477.854 |
| 0.75 | 477.854 |
| 0.7506944444444444 | 477.854 |
| 0.751388888888889 | 476.176 |
| 0.7520833333333333 | 479.541 |
| 0.7527777777777778 | 479.541 |
| 0.7534722222222222 | 481.238 |
| 0.7541666666666668 | 482.945 |
| 0.7548611111111111 | 484.662 |
| 0.7555555555555555 | 486.389 |
| 0.75625 | 488.126 |
| 0.7569444444444445 | 489.873 |
| 0.7576388888888889 | 489.873 |
| 0.7583333333333333 | 493.398 |
| 0.7590277777777777 | 493.398 |
| 0.7597222222222223 | 495.176 |
| 0.7604166666666666 | 493.398 |
| 0.7611111111111111 | 493.398 |
| 0.7618055555555556 | 491.63 |
| 0.7625000000000001 | 489.873 |
| 0.7631944444444444 | 491.63 |
| 0.7638888888888888 | 489.873 |
| 0.7645833333333334 | 488.126 |
| 0.7652777777777778 | 484.662 |
| 0.7659722222222222 | 481.238 |
| 0.7666666666666666 | 476.176 |
| 0.7673611111111112 | 471.198 |
| 0.7680555555555556 | 467.925 |
| 0.7687499999999999 | 463.083 |
| 0.7694444444444444 | 458.318 |
| 0.7701388888888889 | 453.629 |
| 0.7708333333333334 | 447.487 |
| 0.7715277777777777 | 441.469 |
| 0.7722222222222223 | 435.566 |
| 0.7729166666666667 | 431.211 |
| 0.7736111111111111 | 425.497 |
| 0.7743055555555555 | 419.883 |
| 0.775 | 414.364 |
| 0.7756944444444445 | 408.934 |
| 0.7763888888888889 | 402.262 |
| 0.7770833333333332 | 397.012 |
| 0.7777777777777778 | 391.834 |
| 0.7784722222222222 | 386.723 |
| 0.7791666666666667 | 384.191 |
| 0.779861111111111 | 379.171 |
| 0.7805555555555556 | 374.206 |
| 0.78125 | 369.291 |
| 0.7819444444444444 | 364.422 |
| 0.782638888888889 | 359.595 |
| 0.7833333333333333 | 354.805 |
| 0.7840277777777778 | 351.235 |
| 0.7847222222222222 | 347.682 |
| 0.7854166666666668 | 344.144 |
| 0.7861111111111111 | 339.449 |
| 0.7868055555555555 | 335.941 |
| 0.7875 | 331.279 |
| 0.7881944444444445 | 326.633 |
| 0.7888888888888889 | 321.998 |
| 0.7895833333333333 | 317.371 |
| 0.7902777777777777 | 311.594 |
| 0.7909722222222223 | 304.664 |
| 0.7916666666666666 | 296.571 |
| 0.7923611111111111 | 289.616 |
| 0.7930555555555556 | 283.803 |
| 0.7937500000000001 | 279.136 |
| 0.7944444444444444 | 274.454 |
| 0.7951388888888888 | 270.931 |
| 0.7958333333333334 | 267.396 |
| 0.7965277777777778 | 263.851 |
| 0.7972222222222222 | 260.293 |
| 0.7979166666666666 | 256.722 |
| 0.7986111111111112 | 251.939 |
| 0.7993055555555556 | 245.925 |
| 0.7999999999999999 | 239.868 |
| 0.8006944444444444 | 232.54 |
| 0.8013888888888889 | 226.383 |
| 0.8020833333333334 | 217.681 |
| 0.8027777777777777 | 208.881 |
| 0.8034722222222223 | 199.98 |
| 0.8041666666666667 | 188.389 |
| 0.8048611111111111 | 177.946 |
| 0.8055555555555555 | 166.044 |
| 0.80625 | 155.333 |
| 0.8069444444444445 | 145.865 |
| 0.8076388888888889 | 137.683 |
| 0.8083333333333332 | 130.821 |
| 0.8090277777777778 | 125.304 |
| 0.8097222222222222 | 119.766 |
| 0.8104166666666667 | 115.598 |
| 0.811111111111111 | 110.025 |
| 0.8118055555555556 | 104.435 |
| 0.8125 | 97.427 |
| 0.8131944444444444 | 88.991 |
| 0.813888888888889 | 80.536 |
| 0.8145833333333333 | 72.069 |
| 0.8152777777777778 | 67.835 |
| 0.8159722222222222 | 62.189 |
| 0.8166666666666668 | 56.548 |
| 0.8173611111111111 | 50.914 |
| 0.8180555555555555 | 45.29 |
| 0.81875 | 39.68 |
| 0.8194444444444445 | 34.086 |
| 0.8201388888888889 | 29.905 |
| 0.8208333333333333 | 25.736 |
| 0.8215277777777777 | 22.965 |
| 0.8222222222222223 | 20.201 |
| 0.8229166666666666 | 18.822 |
| 0.8236111111111111 | 16.069 |
| 0.8243055555555556 | 14.696 |
| 0.8250000000000001 | 11.956 |
| 0.8256944444444444 | 9.225 |
| 0.8263888888888888 | 7.862 |
| 0.8270833333333334 | 6.503 |
| 0.8277777777777778 | 6.503 |
| 0.8284722222222222 | 5.146 |
| 0.8291666666666666 | 3.791 |
| 0.8298611111111112 | 3.791 |
| 0.8305555555555556 | 2.439 |
| 0.8312499999999999 | 2.439 |
| 0.8319444444444444 | 1.09 |
| 0.8326388888888889 | 1.09 |
| 0.8333333333333334 | 1.09 |
| 0.8340277777777777 | -0.256 |
| 0.8347222222222223 | -0.256 |
| 0.8354166666666667 | -0.256 |
| 0.8361111111111111 | -0.256 |
| 0.8368055555555555 | -0.256 |
| 0.8375 | -0.256 |
| 0.8381944444444445 | -0.256 |
| 0.8388888888888889 | -0.256 |
| 0.8395833333333332 | -0.256 |
| 0.8402777777777778 | -0.256 |
| 0.8409722222222222 | -0.256 |
| 0.8416666666666667 | -0.256 |
| 0.842361111111111 | -0.256 |
| 0.8430555555555556 | -0.256 |
| 0.84375 | -0.256 |
| 0.8444444444444444 | -0.256 |
| 0.845138888888889 | -0.256 |
| 0.8458333333333333 | -0.256 |
| 0.8465277777777778 | -0.256 |
| 0.8472222222222222 | -0.256 |
| 0.8479166666666668 | -0.256 |
| 0.8486111111111111 | -0.256 |
| 0.8493055555555555 | -0.256 |
| 0.85 | -0.256 |
| 0.8506944444444445 | -0.256 |
| 0.8513888888888889 | -0.256 |
| 0.8520833333333333 | -0.256 |
| 0.8527777777777777 | -0.256 |
| 0.8534722222222223 | -0.256 |
| 0.8541666666666666 | -0.256 |
| 0.8548611111111111 | -0.256 |
| 0.8555555555555556 | -0.256 |
| 0.8562500000000001 | -0.256 |
| 0.8569444444444444 | -0.256 |
| 0.8576388888888888 | -0.256 |
| 0.8583333333333334 | -0.256 |
| 0.8590277777777778 | -0.256 |
| 0.8597222222222222 | -0.256 |
| 0.8604166666666666 | -0.256 |
| 0.8611111111111112 | -0.256 |
| 0.8618055555555556 | -0.256 |
| 0.8624999999999999 | -0.256 |
| 0.8631944444444444 | -0.256 |
| 0.8638888888888889 | -0.256 |
| 0.8645833333333334 | -0.256 |
| 0.8652777777777777 | -0.256 |
| 0.8659722222222223 | -0.256 |
| 0.8666666666666667 | -0.256 |
| 0.8673611111111111 | -0.256 |
| 0.8680555555555555 | -0.256 |
| 0.86875 | -0.256 |
| 0.8694444444444445 | -0.256 |
| 0.8701388888888889 | -0.256 |
| 0.8708333333333332 | -0.256 |
| 0.8715277777777778 | -0.256 |
| 0.8722222222222222 | -0.256 |
| 0.8729166666666667 | -0.256 |
| 0.873611111111111 | -0.256 |
| 0.8743055555555556 | -0.256 |
| 0.875 | -0.256 |
| 0.8756944444444444 | -0.256 |
| 0.876388888888889 | -0.256 |
| 0.8770833333333333 | -0.256 |
| 0.8777777777777778 | -0.256 |
| 0.8784722222222222 | -0.256 |
| 0.8791666666666668 | -0.256 |
| 0.8798611111111111 | -0.256 |
| 0.8805555555555555 | -0.256 |
| 0.88125 | -0.256 |
| 0.8819444444444445 | -0.256 |
| 0.8826388888888889 | -0.256 |
| 0.8833333333333333 | -0.256 |
| 0.8840277777777777 | -0.256 |
| 0.8847222222222223 | -0.256 |
| 0.8854166666666666 | -0.256 |
| 0.8861111111111111 | -0.256 |
| 0.8868055555555556 | -0.256 |
| 0.8875000000000001 | -0.256 |
| 0.8881944444444444 | -0.256 |
| 0.8888888888888888 | -0.256 |
| 0.8895833333333334 | -0.256 |
| 0.8902777777777778 | -0.256 |
| 0.8909722222222222 | -0.256 |
| 0.8916666666666666 | -0.256 |
| 0.8923611111111112 | -0.256 |
| 0.8930555555555556 | -0.256 |
| 0.8937499999999999 | -0.256 |
| 0.8944444444444444 | -0.256 |
| 0.8951388888888889 | -0.256 |
| 0.8958333333333334 | -0.256 |
| 0.8965277777777777 | -0.256 |
| 0.8972222222222223 | -0.256 |
| 0.8979166666666667 | -0.256 |
| 0.8986111111111111 | -0.256 |
| 0.8993055555555555 | -0.256 |
| 0.9 | -0.256 |
| 0.9006944444444445 | -0.256 |
| 0.9013888888888889 | -0.256 |
| 0.9020833333333332 | -0.256 |
| 0.9027777777777778 | -0.256 |
| 0.9034722222222222 | -0.256 |
| 0.9041666666666667 | -0.256 |
| 0.904861111111111 | -0.256 |
| 0.9055555555555556 | -0.256 |
| 0.90625 | -0.256 |
| 0.9069444444444444 | -0.256 |
| 0.907638888888889 | -0.256 |
| 0.9083333333333333 | -0.256 |
| 0.9090277777777778 | -0.256 |
| 0.9097222222222222 | -0.256 |
| 0.9104166666666668 | -0.256 |
| 0.9111111111111111 | -0.256 |
| 0.9118055555555555 | -0.256 |
| 0.9125 | -0.256 |
| 0.9131944444444445 | -0.256 |
| 0.9138888888888889 | -0.256 |
| 0.9145833333333333 | -0.256 |
| 0.9152777777777777 | -0.256 |
| 0.9159722222222223 | -0.256 |
| 0.9166666666666666 | -0.256 |
| 0.9173611111111111 | -0.256 |
| 0.9180555555555556 | -0.256 |
| 0.9187500000000001 | -0.256 |
| 0.9194444444444444 | -0.256 |
| 0.9201388888888888 | -0.256 |
| 0.9208333333333334 | -0.256 |
| 0.9215277777777778 | -0.256 |
| 0.9222222222222222 | -0.256 |
| 0.9229166666666666 | -0.256 |
| 0.9236111111111112 | -0.256 |
| 0.9243055555555556 | -0.256 |
| 0.9249999999999999 | -0.256 |
| 0.9256944444444444 | -0.256 |
| 0.9263888888888889 | -0.256 |
| 0.9270833333333334 | -0.256 |
| 0.9277777777777777 | -0.256 |
| 0.9284722222222223 | -0.256 |
| 0.9291666666666667 | -0.256 |
| 0.9298611111111111 | -0.256 |
| 0.9305555555555555 | -0.256 |
| 0.93125 | -0.256 |
| 0.9319444444444445 | -0.256 |
| 0.9326388888888889 | -0.256 |
| 0.9333333333333332 | -0.256 |
| 0.9340277777777778 | -0.256 |
| 0.9347222222222222 | -0.256 |
| 0.9354166666666667 | -0.256 |
| 0.936111111111111 | -0.256 |
| 0.9368055555555556 | -0.256 |
| 0.9375 | -0.256 |
| 0.9381944444444444 | -0.256 |
| 0.938888888888889 | -0.256 |
| 0.9395833333333333 | -0.256 |
| 0.9402777777777778 | -0.256 |
| 0.9409722222222222 | -0.256 |
| 0.9416666666666668 | -0.256 |
| 0.9423611111111111 | -0.256 |
| 0.9430555555555555 | -0.256 |
| 0.94375 | -0.256 |
| 0.9444444444444445 | -0.256 |
| 0.9451388888888889 | -0.256 |
| 0.9458333333333333 | -0.256 |
| 0.9465277777777777 | -0.256 |
| 0.9472222222222223 | -0.256 |
| 0.9479166666666666 | -0.256 |
| 0.9486111111111111 | -0.256 |
| 0.9493055555555556 | -0.256 |
| 0.9500000000000001 | -0.256 |
| 0.9506944444444444 | -0.256 |
| 0.9513888888888888 | -0.256 |
| 0.9520833333333334 | -0.256 |
| 0.9527777777777778 | -0.256 |
| 0.9534722222222222 | -0.256 |
| 0.9541666666666666 | -0.256 |
| 0.9548611111111112 | -0.256 |
| 0.9555555555555556 | -0.256 |
| 0.9562499999999999 | -0.256 |
| 0.9569444444444444 | -0.256 |
| 0.9576388888888889 | -0.256 |
| 0.9583333333333334 | -0.256 |
| 0.9590277777777777 | -0.256 |
| 0.9597222222222223 | -0.256 |
| 0.9604166666666667 | -0.256 |
| 0.9611111111111111 | -0.256 |
| 0.9618055555555555 | -0.256 |
| 0.9625 | -0.256 |
| 0.9631944444444445 | -0.256 |
| 0.9638888888888889 | -0.256 |
| 0.9645833333333332 | -0.256 |
| 0.9652777777777778 | -0.256 |
| 0.9659722222222222 | -0.256 |
| 0.9666666666666667 | -0.256 |
| 0.967361111111111 | -0.256 |
| 0.9680555555555556 | -0.256 |
| 0.96875 | -0.256 |
| 0.9694444444444444 | -0.256 |
| 0.970138888888889 | -0.256 |
| 0.9708333333333333 | -0.256 |
| 0.9715277777777778 | -0.256 |
| 0.9722222222222222 | -0.256 |
| 0.9729166666666668 | -0.256 |
| 0.9736111111111111 | -0.256 |
| 0.9743055555555555 | -0.256 |
| 0.975 | -0.256 |
| 0.9756944444444445 | -0.256 |
| 0.9763888888888889 | -0.256 |
| 0.9770833333333333 | -0.256 |
| 0.9777777777777777 | -0.256 |
| 0.9784722222222223 | -0.256 |
| 0.9791666666666666 | -0.256 |
| 0.9798611111111111 | -0.256 |
| 0.9805555555555556 | -0.256 |
| 0.9812500000000001 | -0.256 |
| 0.9819444444444444 | -0.256 |
| 0.9826388888888888 | -0.256 |
| 0.9833333333333334 | -0.256 |
| 0.9840277777777778 | -0.256 |
| 0.9847222222222222 | -0.256 |
| 0.9854166666666666 | -0.256 |
| 0.9861111111111112 | -0.256 |
| 0.9868055555555556 | -0.256 |
| 0.9874999999999999 | -0.256 |
| 0.9881944444444444 | -0.256 |
| 0.9888888888888889 | -0.256 |
| 0.9895833333333334 | -0.256 |
| 0.9902777777777777 | -0.256 |
| 0.9909722222222223 | -0.256 |
| 0.9916666666666667 | -0.256 |
| 0.9923611111111111 | -0.256 |
| 0.9930555555555555 | -0.256 |
| 0.99375 | -0.256 |
| 0.9944444444444445 | -0.256 |
| 0.9951388888888889 | -0.256 |
| 0.9958333333333332 | -0.256 |
| 0.9965277777777778 | -0.256 |
| 0.9972222222222222 | -0.256 |
| 0.9979166666666667 | -0.256 |
| 0.998611111111111 | -0.256 |
| 0.9993055555555556 | 0 |